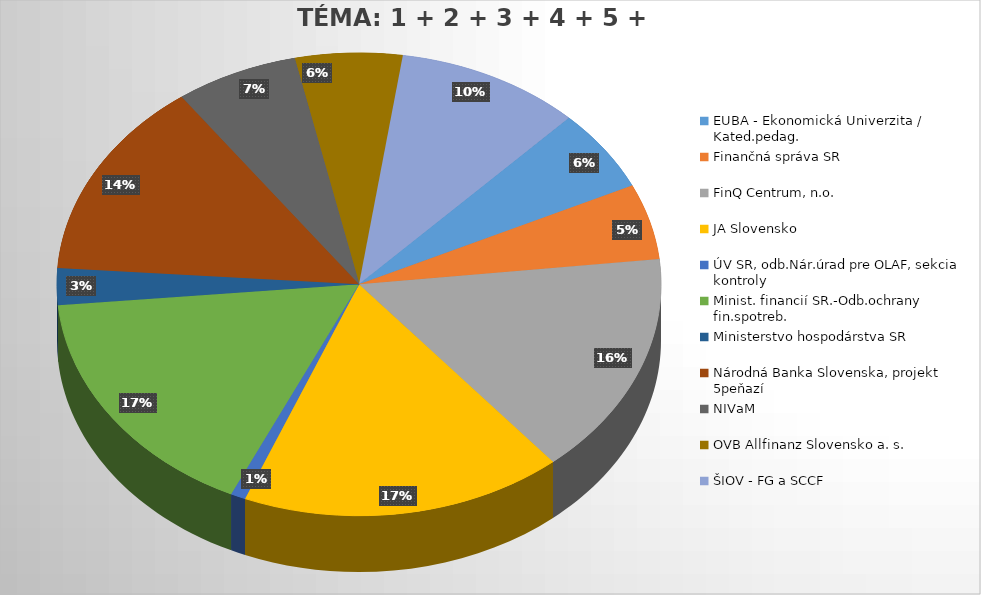
| Category | Series 0 |
|---|---|
| EUBA - Ekonomická Univerzita / Kated.pedag. | 36 |
| Finančná správa SR | 33 |
| FinQ Centrum, n.o. | 98 |
| JA Slovensko | 108 |
| ÚV SR, odb.Nár.úrad pre OLAF, sekcia kontroly | 5 |
| Minist. financií SR.-Odb.ochrany fin.spotreb. | 104 |
| Ministerstvo hospodárstva SR | 16 |
| Národná Banka Slovenska, projekt 5peňazí | 87 |
| NIVaM | 41 |
| OVB Allfinanz Slovensko a. s.  | 36 |
| ŠIOV - FG a SCCF | 62 |